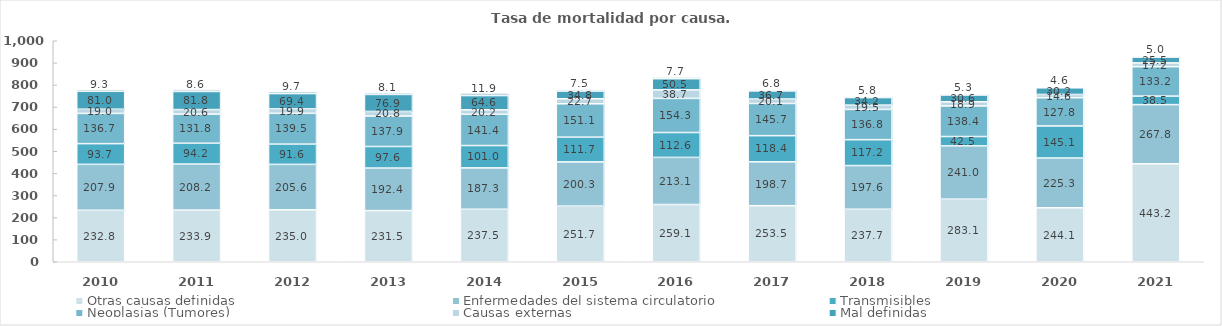
| Category | Otras causas definidas | Enfermedades del sistema circulatorio | Transmisibles | Neoplasias (Tumores) | Causas externas | Mal definidas | Ciertas afecciones del periodo perinatal |
|---|---|---|---|---|---|---|---|
| 2010.0 | 232.821 | 207.928 | 93.738 | 136.682 | 19.034 | 81.049 | 9.305 |
| 2011.0 | 233.872 | 208.174 | 94.232 | 131.832 | 20.57 | 81.753 | 8.582 |
| 2012.0 | 234.996 | 205.629 | 91.577 | 139.493 | 19.898 | 69.382 | 9.663 |
| 2013.0 | 231.462 | 192.41 | 97.623 | 137.901 | 20.758 | 76.95 | 8.053 |
| 2014.0 | 237.502 | 187.308 | 101.031 | 141.441 | 20.199 | 64.568 | 11.913 |
| 2015.0 | 251.686 | 200.283 | 111.745 | 151.115 | 22.737 | 34.759 | 7.54 |
| 2016.0 | 259.08 | 213.115 | 112.629 | 154.313 | 38.697 | 50.519 | 7.713 |
| 2017.0 | 253.535 | 198.673 | 118.367 | 145.7 | 20.143 | 36.736 | 6.822 |
| 2018.0 | 237.684 | 197.568 | 117.154 | 136.812 | 19.51 | 34.195 | 5.762 |
| 2019.0 | 283.126 | 241.001 | 42.521 | 138.399 | 18.904 | 30.611 | 5.333 |
| 2020.0 | 244.117 | 225.267 | 145.118 | 127.824 | 14.63 | 30.212 | 4.567 |
| 2021.0 | 443.224 | 267.795 | 38.542 | 133.193 | 17.169 | 25.465 | 5.046 |